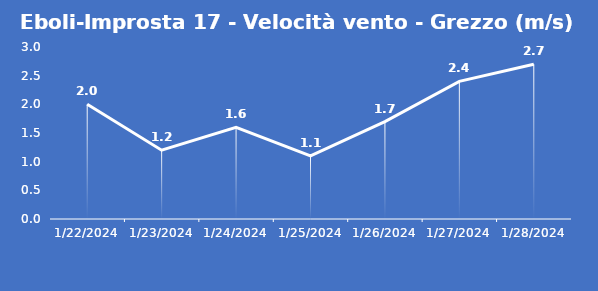
| Category | Eboli-Improsta 17 - Velocità vento - Grezzo (m/s) |
|---|---|
| 1/22/24 | 2 |
| 1/23/24 | 1.2 |
| 1/24/24 | 1.6 |
| 1/25/24 | 1.1 |
| 1/26/24 | 1.7 |
| 1/27/24 | 2.4 |
| 1/28/24 | 2.7 |